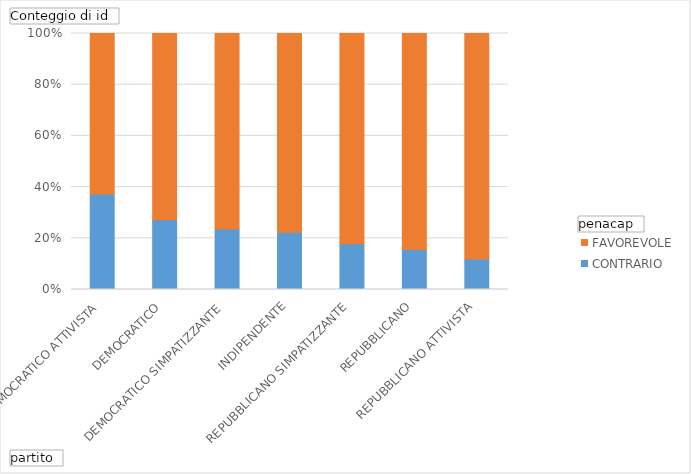
| Category | CONTRARIO | FAVOREVOLE |
|---|---|---|
| DEMOCRATICO ATTIVISTA | 0.373 | 0.627 |
| DEMOCRATICO | 0.272 | 0.728 |
| DEMOCRATICO SIMPATIZZANTE | 0.237 | 0.763 |
| INDIPENDENTE | 0.224 | 0.776 |
| REPUBBLICANO SIMPATIZZANTE | 0.179 | 0.821 |
| REPUBBLICANO | 0.156 | 0.844 |
| REPUBBLICANO ATTIVISTA | 0.119 | 0.881 |